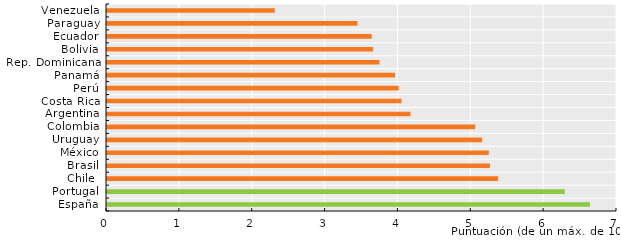
| Category | Series 0 |
|---|---|
| España | 6.63 |
| Portugal | 6.283 |
| Chile  | 5.367 |
| Brasil | 5.256 |
| México | 5.241 |
| Uruguay | 5.148 |
| Colombia | 5.054 |
| Argentina | 4.165 |
| Costa Rica | 4.042 |
| Perú | 4.003 |
| Panamá | 3.953 |
| Rep. Dominicana | 3.74 |
| Bolivia | 3.653 |
| Ecuador | 3.634 |
| Paraguay | 3.438 |
| Venezuela | 2.303 |